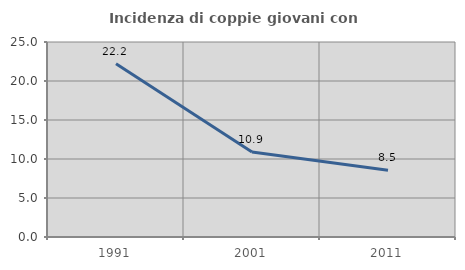
| Category | Incidenza di coppie giovani con figli |
|---|---|
| 1991.0 | 22.222 |
| 2001.0 | 10.891 |
| 2011.0 | 8.547 |